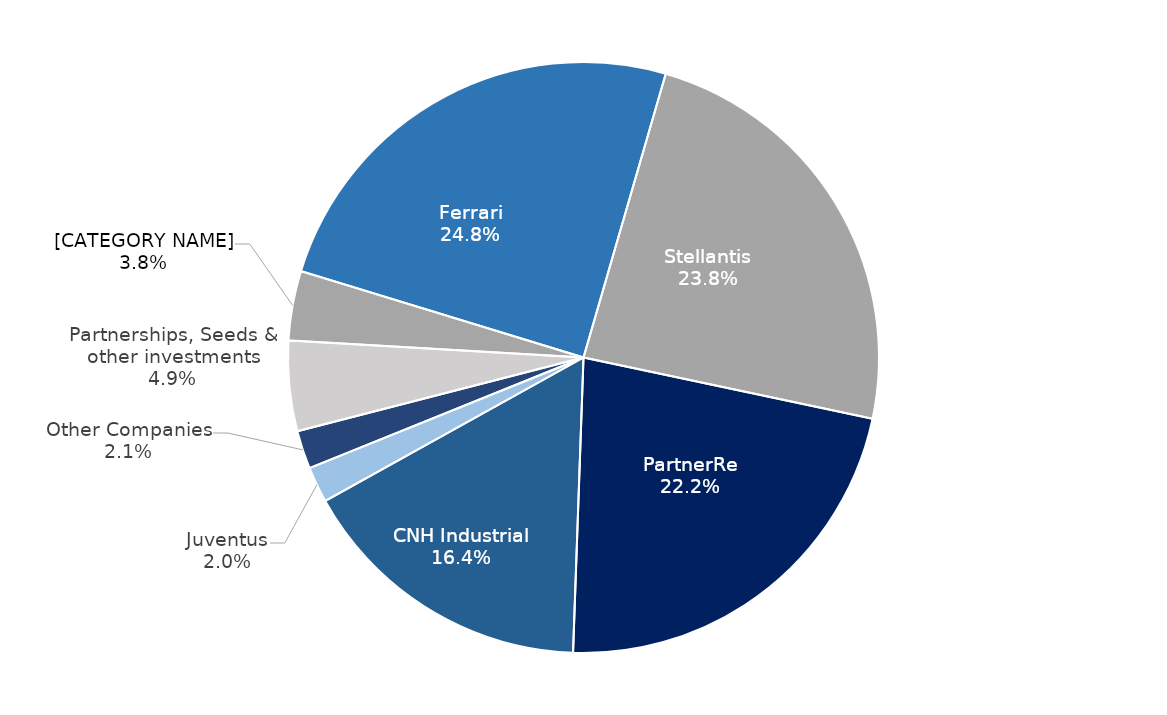
| Category | Series 0 |
|---|---|
| Ferrari | 9189 |
| Stellantis | 8842 |
| PartnerRe | 8250 |
| CNH Industrial | 6072 |
| Juventus | 727 |
| Other Companies | 779 |
| Partnerships, Seeds & other investments | 1830 |
| Others | 1410 |